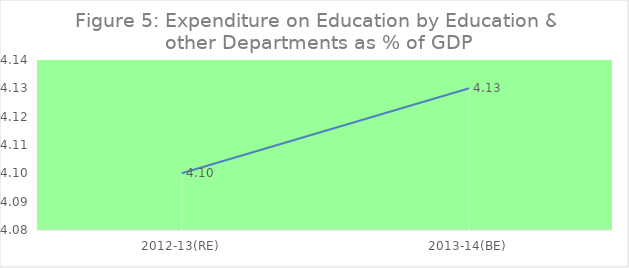
| Category |  Expenditure on Education by Education & other Departments as % of GDP |
|---|---|
| 2012-13(RE) | 4.1 |
| 2013-14(BE) | 4.13 |